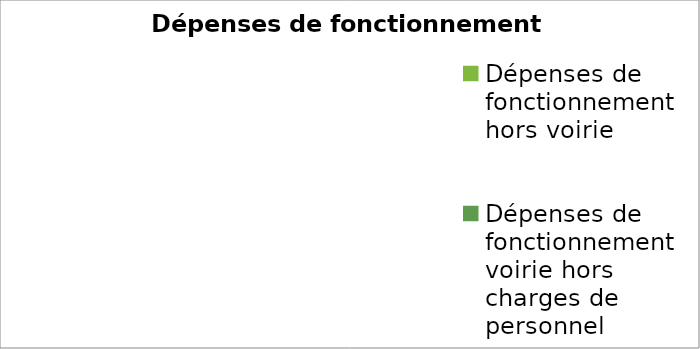
| Category | Series 0 |
|---|---|
| Dépenses de fonctionnement hors voirie | 0 |
| Dépenses de fonctionnement voirie hors charges de personnel | 0 |